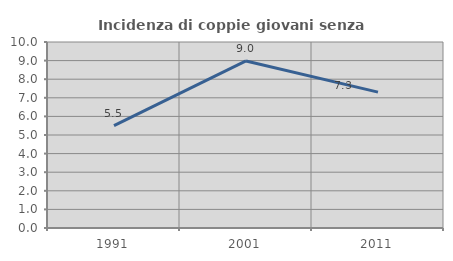
| Category | Incidenza di coppie giovani senza figli |
|---|---|
| 1991.0 | 5.505 |
| 2001.0 | 8.981 |
| 2011.0 | 7.306 |